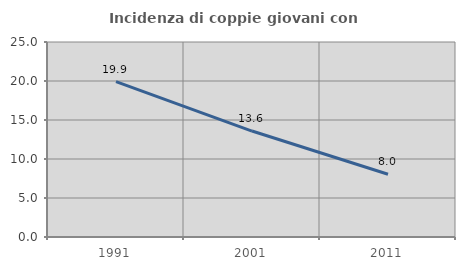
| Category | Incidenza di coppie giovani con figli |
|---|---|
| 1991.0 | 19.917 |
| 2001.0 | 13.584 |
| 2011.0 | 8.041 |